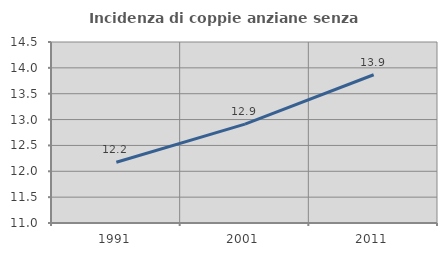
| Category | Incidenza di coppie anziane senza figli  |
|---|---|
| 1991.0 | 12.176 |
| 2001.0 | 12.911 |
| 2011.0 | 13.867 |